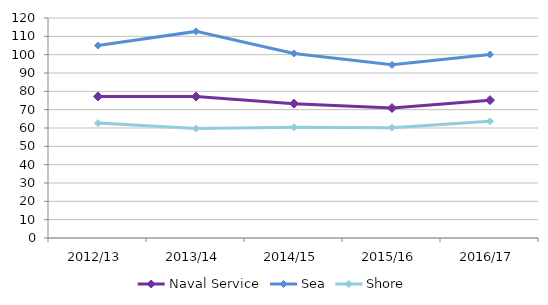
| Category | Naval Service | Sea | Shore |
|---|---|---|---|
| 2012/13 | 77.196 | 104.975 | 62.665 |
| 2013/14 | 77.124 | 112.693 | 59.665 |
| 2014/15 | 73.289 | 100.65 | 60.388 |
| 2015/16 | 70.896 | 94.455 | 60.176 |
| 2016/17 | 75.173 | 100.11 | 63.669 |